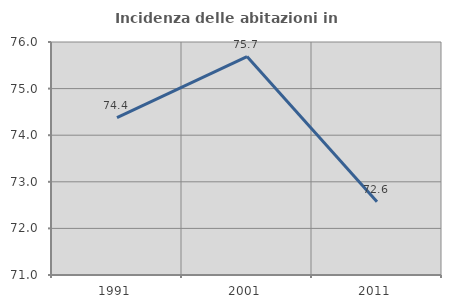
| Category | Incidenza delle abitazioni in proprietà  |
|---|---|
| 1991.0 | 74.376 |
| 2001.0 | 75.688 |
| 2011.0 | 72.572 |